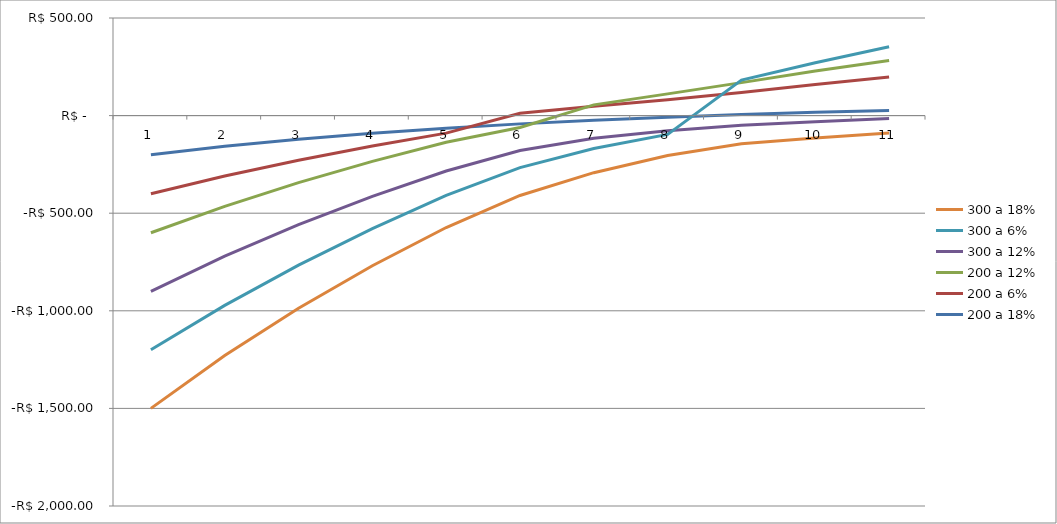
| Category | 200 a 18% | 200 a 6% | 200 a 12% | 300 a 12% | 300 a 6% | 300 a 18% |
|---|---|---|---|---|---|---|
| 0 | -200 | -200 | -200 | -300 | -300 | -300 |
| 1 | -157.288 | -152.453 | -155 | -255 | -252.453 | -257.288 |
| 2 | -121.092 | -107.597 | -114.821 | -214.821 | -207.597 | -221.092 |
| 3 | -90.417 | -65.28 | -78.948 | -178.948 | -165.28 | -190.417 |
| 4 | -64.421 | -25.359 | -46.918 | -146.918 | -125.359 | -164.421 |
| 5 | -42.391 | 12.303 | -18.319 | -118.319 | -87.697 | -142.391 |
| 6 | -23.721 | 47.833 | 7.215 | -92.785 | -52.167 | -123.721 |
| 7 | -7.899 | 81.352 | 30.013 | -69.987 | -18.648 | -107.899 |
| 8 | 5.509 | 112.974 | 50.369 | -49.631 | 12.974 | -94.491 |
| 9 | 16.872 | 142.805 | 68.544 | -31.456 | 42.805 | -83.128 |
| 10 | 26.502 | 170.948 | 84.771 | -15.229 | 70.948 | -73.498 |